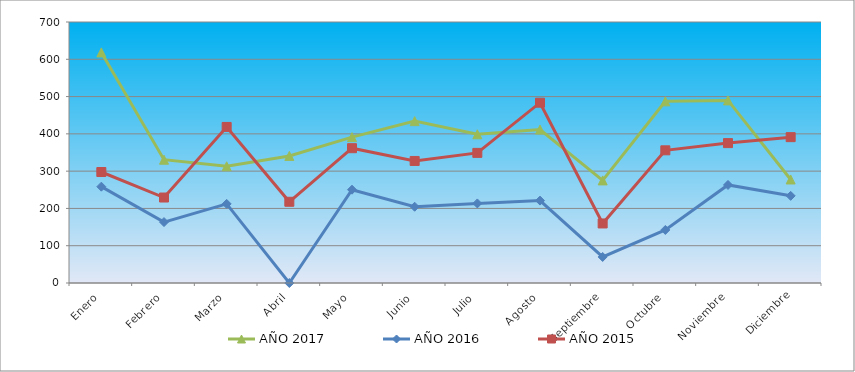
| Category | AÑO 2017 | AÑO 2016 | AÑO 2015 |
|---|---|---|---|
| Enero | 618.459 | 258.351 | 297.664 |
| Febrero | 330.686 | 163.352 | 229.236 |
| Marzo | 313.016 | 212.135 | 418.555 |
| Abril | 340.783 | 0 | 217.831 |
| Mayo | 391.27 | 250.243 | 361.531 |
| Junio | 434.183 | 204.513 | 327.317 |
| Julio | 398.843 | 213.405 | 348.986 |
| Agosto | 411.464 | 221.026 | 483.562 |
| Septiembre | 275.151 | 69.865 | 159.667 |
| Octubre | 487.194 | 142.27 | 355.828 |
| Noviembre | 489.718 | 262.945 | 375.217 |
| Diciembre | 277.675 | 233.729 | 391.183 |